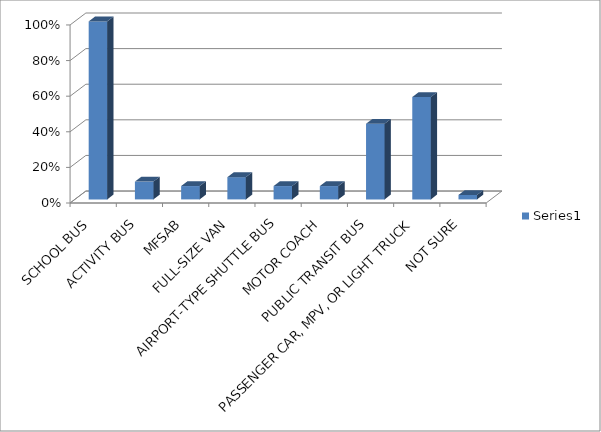
| Category | Series 0 |
|---|---|
| SCHOOL BUS | 1 |
| ACTIVITY BUS | 0.1 |
| MFSAB | 0.075 |
| FULL-SIZE VAN | 0.125 |
| AIRPORT-TYPE SHUTTLE BUS | 0.075 |
| MOTOR COACH | 0.075 |
| PUBLIC TRANSIT BUS | 0.425 |
| PASSENGER CAR, MPV, OR LIGHT TRUCK | 0.575 |
| NOT SURE | 0.025 |